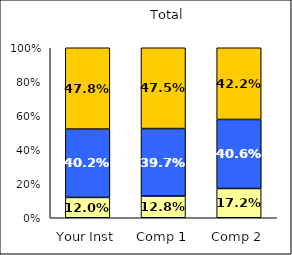
| Category | Low Positive Cross-Racial Interaction | Average Positive Cross-Racial Interaction | High Positive Cross-Racial Interaction |
|---|---|---|---|
| Your Inst | 0.12 | 0.402 | 0.478 |
| Comp 1 | 0.128 | 0.397 | 0.475 |
| Comp 2 | 0.172 | 0.406 | 0.422 |